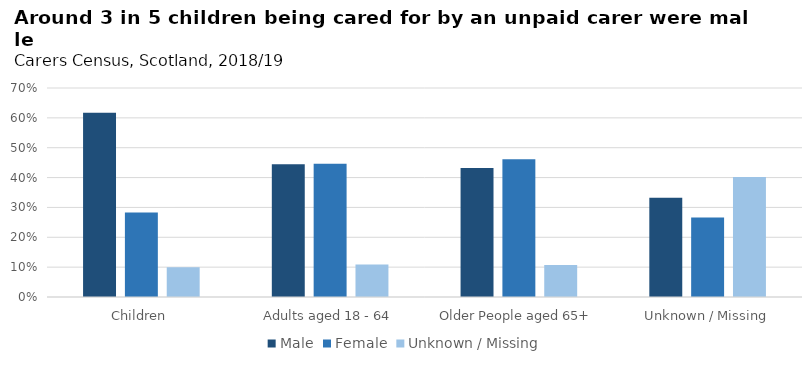
| Category | Male | Female | Unknown / Missing |
|---|---|---|---|
| Children | 0.617 | 0.283 | 0.1 |
| Adults aged 18 - 64 | 0.445 | 0.446 | 0.109 |
| Older People aged 65+ | 0.432 | 0.461 | 0.107 |
| Unknown / Missing | 0.332 | 0.266 | 0.402 |